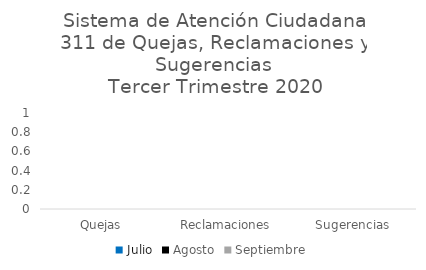
| Category | Julio | Agosto | Septiembre |
|---|---|---|---|
| Quejas | 0 | 0 | 0 |
| Reclamaciones | 0 | 0 | 0 |
| Sugerencias | 0 | 0 | 0 |